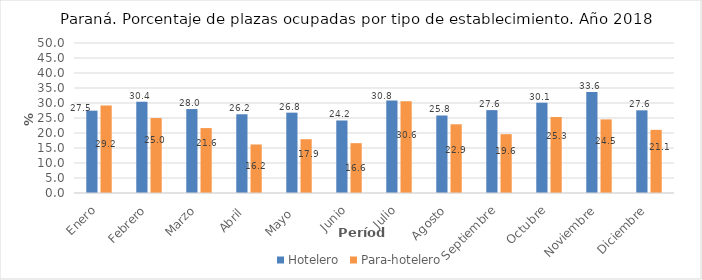
| Category | Hotelero | Para-hotelero |
|---|---|---|
| Enero | 27.451 | 29.202 |
| Febrero | 30.45 | 24.986 |
| Marzo | 27.981 | 21.641 |
| Abril  | 26.248 | 16.173 |
| Mayo  | 26.782 | 17.932 |
| Junio | 24.173 | 16.613 |
| Julio | 30.797 | 30.599 |
| Agosto | 25.835 | 22.906 |
| Septiembre | 27.629 | 19.606 |
| Octubre | 30.111 | 25.343 |
| Noviembre | 33.64 | 24.54 |
| Diciembre | 27.559 | 21.053 |